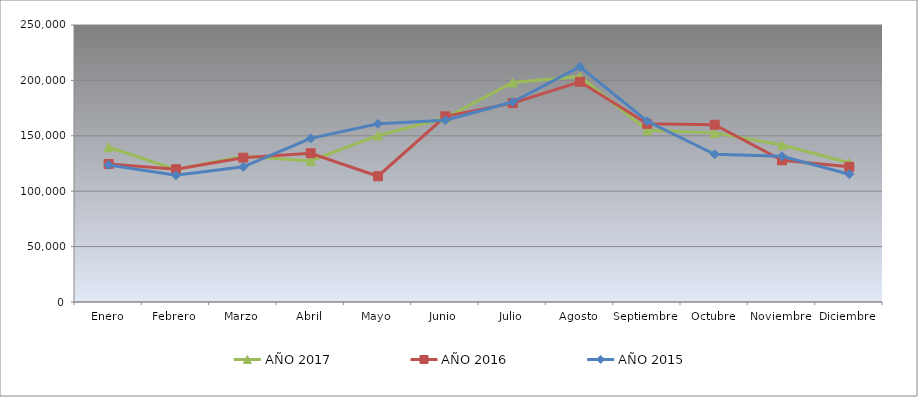
| Category | AÑO 2017 | AÑO 2016 | AÑO 2015 |
|---|---|---|---|
| Enero | 139680 | 124590 | 123680 |
| Febrero | 119660 | 119860 | 114340 |
| Marzo | 131600 | 130270 | 122020 |
| Abril | 127360 | 134260 | 147670 |
| Mayo | 150300 | 113510 | 160830 |
| Junio | 166000 | 167540 | 163970 |
| Julio | 198100 | 179480 | 180510 |
| Agosto | 203460 | 198760 | 212290 |
| Septiembre | 154900 | 160780 | 163150 |
| Octubre | 152640 | 160000 | 133330 |
| Noviembre | 141720 | 127900 | 131540 |
| Diciembre | 125720 | 122020 | 115330 |